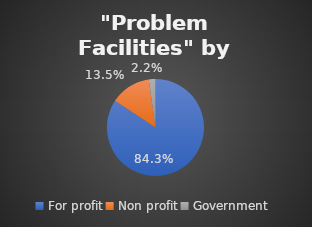
| Category | Series 0 |
|---|---|
| For profit | 0.843 |
| Non profit | 0.135 |
| Government | 0.022 |